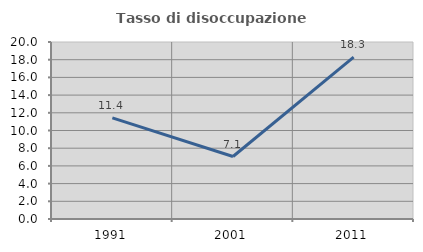
| Category | Tasso di disoccupazione giovanile  |
|---|---|
| 1991.0 | 11.429 |
| 2001.0 | 7.062 |
| 2011.0 | 18.293 |